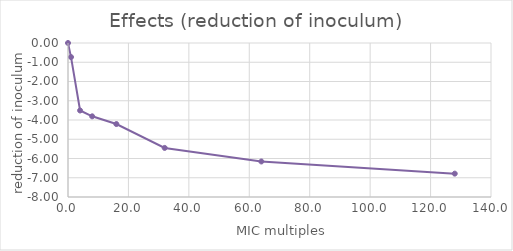
| Category | Series 3 |
|---|---|
| 0.0 | 0 |
| 1.0 | -0.731 |
| 4.0 | -3.506 |
| 8.0 | -3.809 |
| 16.0 | -4.21 |
| 32.0 | -5.45 |
| 64.0 | -6.154 |
| 128.0 | -6.787 |